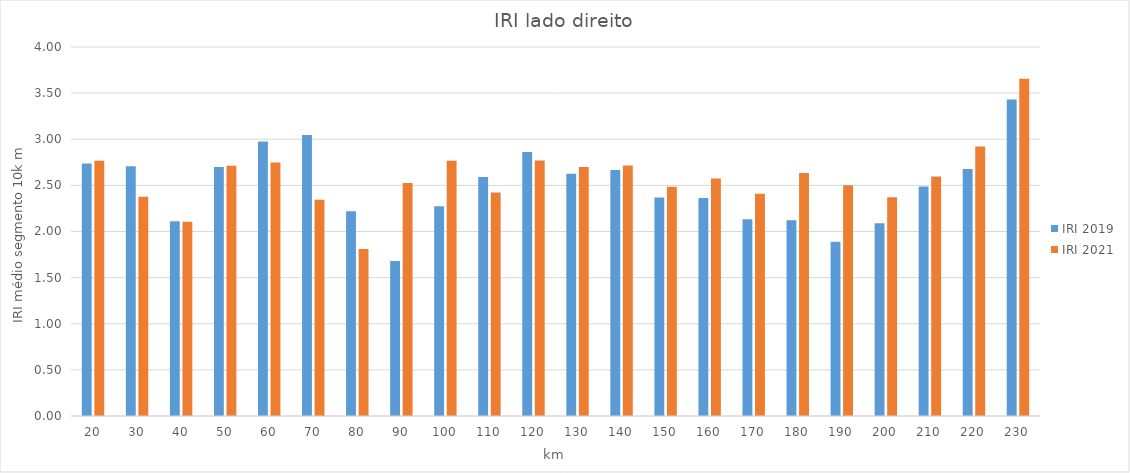
| Category | IRI 2019 | IRI 2021 |
|---|---|---|
| 20.0 | 2.738 | 2.766 |
| 30.0 | 2.708 | 2.377 |
| 40.0 | 2.111 | 2.105 |
| 50.0 | 2.698 | 2.711 |
| 60.0 | 2.976 | 2.747 |
| 70.0 | 3.046 | 2.344 |
| 80.0 | 2.22 | 1.81 |
| 90.0 | 1.68 | 2.525 |
| 100.0 | 2.273 | 2.768 |
| 110.0 | 2.59 | 2.423 |
| 120.0 | 2.861 | 2.769 |
| 130.0 | 2.626 | 2.7 |
| 140.0 | 2.667 | 2.716 |
| 150.0 | 2.369 | 2.484 |
| 160.0 | 2.363 | 2.575 |
| 170.0 | 2.134 | 2.408 |
| 180.0 | 2.121 | 2.634 |
| 190.0 | 1.889 | 2.501 |
| 200.0 | 2.088 | 2.371 |
| 210.0 | 2.489 | 2.595 |
| 220.0 | 2.677 | 2.92 |
| 230.0 | 3.431 | 3.655 |